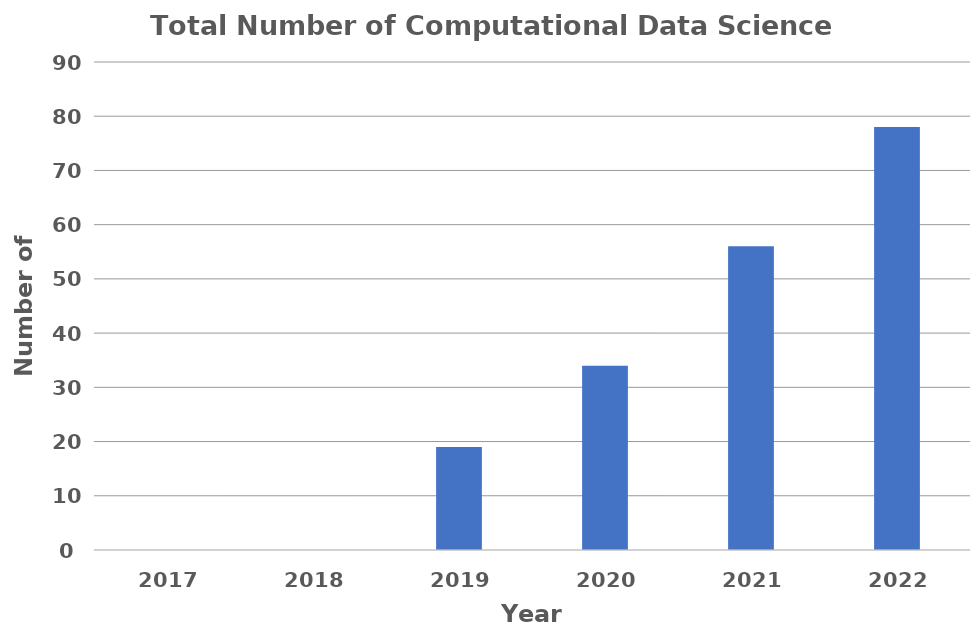
| Category | Total Number of Computational Data Science Students |
|---|---|
| 2017.0 | 0 |
| 2018.0 | 0 |
| 2019.0 | 19 |
| 2020.0 | 34 |
| 2021.0 | 56 |
| 2022.0 | 78 |